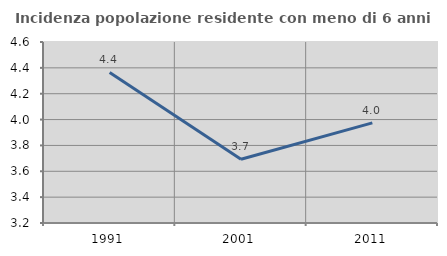
| Category | Incidenza popolazione residente con meno di 6 anni |
|---|---|
| 1991.0 | 4.365 |
| 2001.0 | 3.693 |
| 2011.0 | 3.974 |